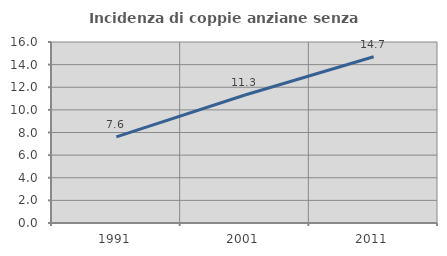
| Category | Incidenza di coppie anziane senza figli  |
|---|---|
| 1991.0 | 7.61 |
| 2001.0 | 11.311 |
| 2011.0 | 14.699 |